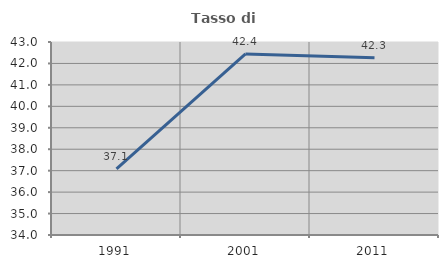
| Category | Tasso di occupazione   |
|---|---|
| 1991.0 | 37.079 |
| 2001.0 | 42.442 |
| 2011.0 | 42.262 |